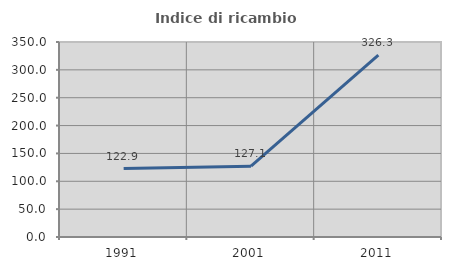
| Category | Indice di ricambio occupazionale  |
|---|---|
| 1991.0 | 122.936 |
| 2001.0 | 127.083 |
| 2011.0 | 326.316 |